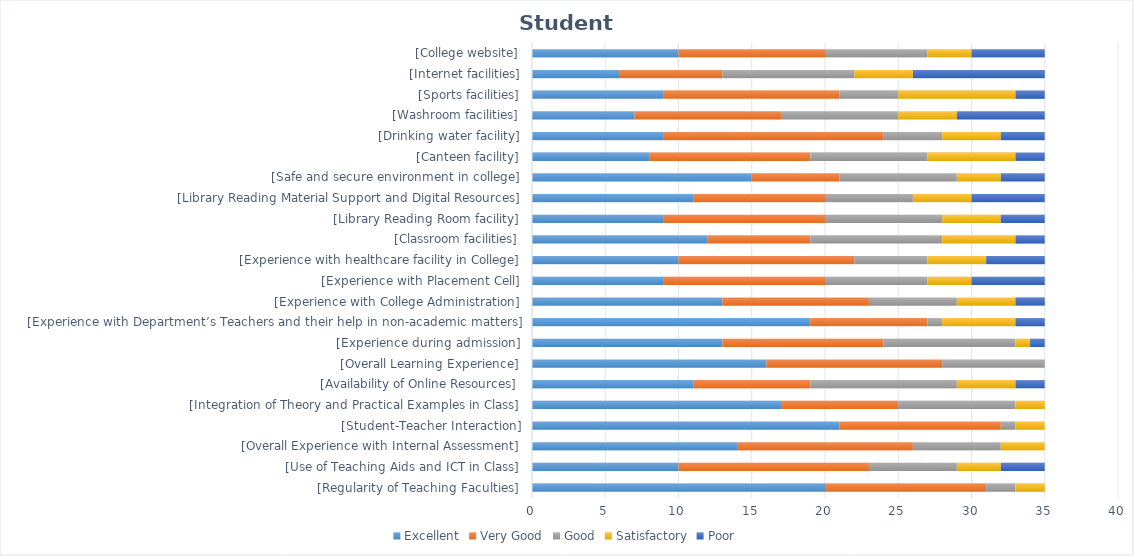
| Category | Excellent | Very Good | Good | Satisfactory | Poor |
|---|---|---|---|---|---|
|     [Regularity of Teaching Faculties] | 20 | 11 | 2 | 2 | 0 |
|     [Use of Teaching Aids and ICT in Class] | 10 | 13 | 6 | 3 | 3 |
|     [Overall Experience with Internal Assessment] | 14 | 12 | 6 | 3 | 0 |
|     [Student-Teacher Interaction] | 21 | 11 | 1 | 2 | 0 |
|     [Integration of Theory and Practical Examples in Class] | 17 | 8 | 8 | 2 | 0 |
|     [Availability of Online Resources] | 11 | 8 | 10 | 4 | 2 |
|     [Overall Learning Experience] | 16 | 12 | 7 | 0 | 0 |
|     [Experience during admission] | 13 | 11 | 9 | 1 | 1 |
|     [Experience with Department’s Teachers and their help in non-academic matters] | 19 | 8 | 1 | 5 | 2 |
|     [Experience with College Administration] | 13 | 10 | 6 | 4 | 2 |
|     [Experience with Placement Cell] | 9 | 11 | 7 | 3 | 5 |
|     [Experience with healthcare facility in College] | 10 | 12 | 5 | 4 | 4 |
|     [Classroom facilities] | 12 | 7 | 9 | 5 | 2 |
|     [Library Reading Room facility] | 9 | 11 | 8 | 4 | 3 |
|     [Library Reading Material Support and Digital Resources] | 11 | 9 | 6 | 4 | 5 |
|     [Safe and secure environment in college] | 15 | 6 | 8 | 3 | 3 |
|     [Canteen facility] | 8 | 11 | 8 | 6 | 2 |
|     [Drinking water facility] | 9 | 15 | 4 | 4 | 3 |
|     [Washroom facilities] | 7 | 10 | 8 | 4 | 6 |
|     [Sports facilities] | 9 | 12 | 4 | 8 | 2 |
|     [Internet facilities] | 6 | 7 | 9 | 4 | 9 |
|     [College website] | 10 | 10 | 7 | 3 | 5 |